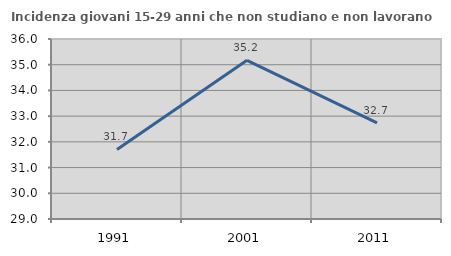
| Category | Incidenza giovani 15-29 anni che non studiano e non lavorano  |
|---|---|
| 1991.0 | 31.706 |
| 2001.0 | 35.17 |
| 2011.0 | 32.737 |